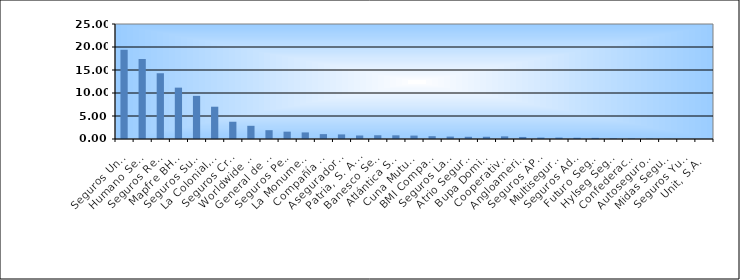
| Category | Series 0 |
|---|---|
| Seguros Universal, S. A. | 19.397 |
| Humano Seguros, S. A. | 17.386 |
| Seguros Reservas, S. A. | 14.295 |
| Mapfre BHD Compañía de Seguros | 11.166 |
| Seguros Sura, S.A. | 9.379 |
| La Colonial, S. A., Compañia De Seguros | 7.019 |
| Seguros Crecer, S. A. | 3.75 |
| Worldwide Seguros, S. A. | 2.866 |
| General de Seguros, S. A. | 1.915 |
| Seguros Pepín, S. A. | 1.595 |
| La Monumental de Seguros, S. A. | 1.43 |
| Compañía Dominicana de Seguros, C. por A. | 1.058 |
| Aseguradora Agropecuaria Dominicana, S. A. | 0.997 |
| Patria, S. A., Compañía de Seguros | 0.762 |
| Banesco Seguros | 0.812 |
| Atlántica Seguros, S. A. | 0.795 |
| Cuna Mutual Insurance Society Dominicana | 0.741 |
| BMI Compañía de Seguros, S. A. | 0.612 |
| Seguros La Internacional, S. A. | 0.528 |
| Atrio Seguros S. A. | 0.482 |
| Bupa Dominicana, S. A. | 0.488 |
| Cooperativa Nacional De Seguros, Inc  | 0.571 |
| Angloamericana de Seguros, S. A. | 0.443 |
| Seguros APS, S.R.L. | 0.312 |
| Multiseguros Su, S.A. | 0.311 |
| Seguros Ademi, S.A. | 0.268 |
| Futuro Seguros | 0.247 |
| Hylseg Seguros S.A | 0.128 |
| Confederación del Canadá Dominicana, S. A. | 0.101 |
| Autoseguro, S. A. | 0.077 |
| Midas Seguros, S.A. | 0.032 |
| Seguros Yunen, S.A. | 0.022 |
| Unit, S.A. | 0.016 |